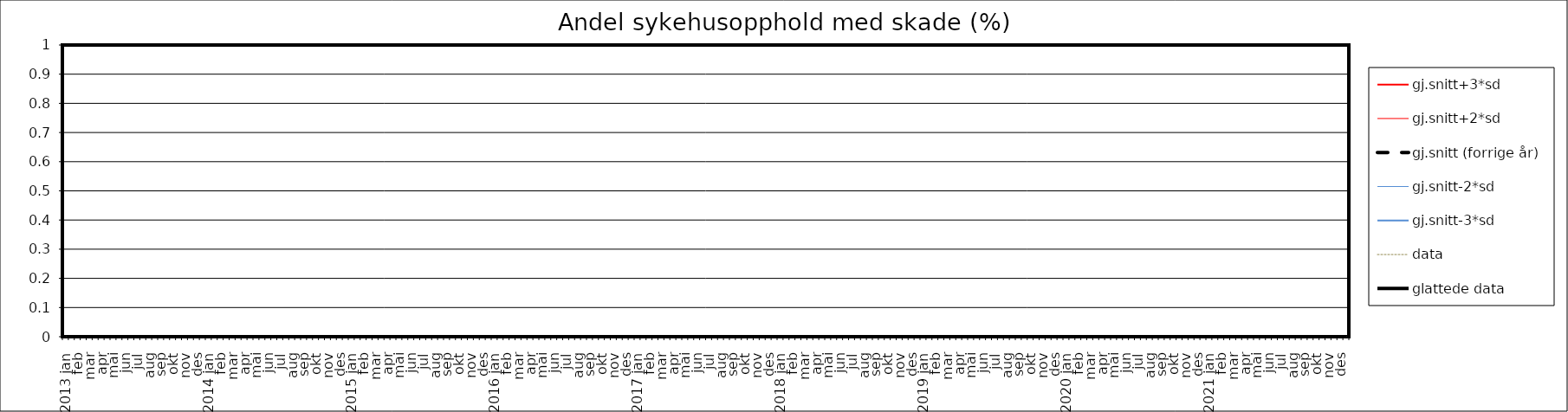
| Category | gj.snitt+3*sd | gj.snitt+2*sd | gj.snitt (forrige år) | gj.snitt-2*sd | gj.snitt-3*sd | data | glattede data |
|---|---|---|---|---|---|---|---|
| 2013 jan | 0 | 0 | 0 | 0 | 0 | 0 | 0 |
|  | 0 | 0 | 0 | 0 | 0 | 0 | 0 |
| feb | 0 | 0 | 0 | 0 | 0 | 0 | 0 |
|  | 0 | 0 | 0 | 0 | 0 | 0 | 0 |
| mar | 0 | 0 | 0 | 0 | 0 | 0 | 0 |
|  | 0 | 0 | 0 | 0 | 0 | 0 | 0 |
| apr | 0 | 0 | 0 | 0 | 0 | 0 | 0 |
|  | 0 | 0 | 0 | 0 | 0 | 0 | 0 |
| mai | 0 | 0 | 0 | 0 | 0 | 0 | 0 |
|  | 0 | 0 | 0 | 0 | 0 | 0 | 0 |
| jun | 0 | 0 | 0 | 0 | 0 | 0 | 0 |
|  | 0 | 0 | 0 | 0 | 0 | 0 | 0 |
| jul | 0 | 0 | 0 | 0 | 0 | 0 | 0 |
|  | 0 | 0 | 0 | 0 | 0 | 0 | 0 |
| aug | 0 | 0 | 0 | 0 | 0 | 0 | 0 |
|  | 0 | 0 | 0 | 0 | 0 | 0 | 0 |
| sep | 0 | 0 | 0 | 0 | 0 | 0 | 0 |
|  | 0 | 0 | 0 | 0 | 0 | 0 | 0 |
| okt | 0 | 0 | 0 | 0 | 0 | 0 | 0 |
|  | 0 | 0 | 0 | 0 | 0 | 0 | 0 |
| nov | 0 | 0 | 0 | 0 | 0 | 0 | 0 |
|  | 0 | 0 | 0 | 0 | 0 | 0 | 0 |
| des | 0 | 0 | 0 | 0 | 0 | 0 | 0 |
|  | 0 | 0 | 0 | 0 | 0 | 0 | 0 |
| 2014 jan | 0 | 0 | 0 | 0 | 0 | 0 | 0 |
|  | 0 | 0 | 0 | 0 | 0 | 0 | 0 |
| feb | 0 | 0 | 0 | 0 | 0 | 0 | 0 |
|  | 0 | 0 | 0 | 0 | 0 | 0 | 0 |
| mar | 0 | 0 | 0 | 0 | 0 | 0 | 0 |
|  | 0 | 0 | 0 | 0 | 0 | 0 | 0 |
| apr | 0 | 0 | 0 | 0 | 0 | 0 | 0 |
|  | 0 | 0 | 0 | 0 | 0 | 0 | 0 |
| mai | 0 | 0 | 0 | 0 | 0 | 0 | 0 |
|  | 0 | 0 | 0 | 0 | 0 | 0 | 0 |
| jun | 0 | 0 | 0 | 0 | 0 | 0 | 0 |
|  | 0 | 0 | 0 | 0 | 0 | 0 | 0 |
| jul | 0 | 0 | 0 | 0 | 0 | 0 | 0 |
|  | 0 | 0 | 0 | 0 | 0 | 0 | 0 |
| aug | 0 | 0 | 0 | 0 | 0 | 0 | 0 |
|  | 0 | 0 | 0 | 0 | 0 | 0 | 0 |
| sep | 0 | 0 | 0 | 0 | 0 | 0 | 0 |
|  | 0 | 0 | 0 | 0 | 0 | 0 | 0 |
| okt | 0 | 0 | 0 | 0 | 0 | 0 | 0 |
|  | 0 | 0 | 0 | 0 | 0 | 0 | 0 |
| nov | 0 | 0 | 0 | 0 | 0 | 0 | 0 |
|  | 0 | 0 | 0 | 0 | 0 | 0 | 0 |
| des | 0 | 0 | 0 | 0 | 0 | 0 | 0 |
|  | 0 | 0 | 0 | 0 | 0 | 0 | 0 |
| 2015 jan | 0 | 0 | 0 | 0 | 0 | 0 | 0 |
|  | 0 | 0 | 0 | 0 | 0 | 0 | 0 |
| feb | 0 | 0 | 0 | 0 | 0 | 0 | 0 |
|  | 0 | 0 | 0 | 0 | 0 | 0 | 0 |
| mar | 0 | 0 | 0 | 0 | 0 | 0 | 0 |
|  | 0 | 0 | 0 | 0 | 0 | 0 | 0 |
| apr | 0 | 0 | 0 | 0 | 0 | 0 | 0 |
|  | 0 | 0 | 0 | 0 | 0 | 0 | 0 |
| mai | 0 | 0 | 0 | 0 | 0 | 0 | 0 |
|  | 0 | 0 | 0 | 0 | 0 | 0 | 0 |
| jun | 0 | 0 | 0 | 0 | 0 | 0 | 0 |
|  | 0 | 0 | 0 | 0 | 0 | 0 | 0 |
| jul | 0 | 0 | 0 | 0 | 0 | 0 | 0 |
|  | 0 | 0 | 0 | 0 | 0 | 0 | 0 |
| aug | 0 | 0 | 0 | 0 | 0 | 0 | 0 |
|  | 0 | 0 | 0 | 0 | 0 | 0 | 0 |
| sep | 0 | 0 | 0 | 0 | 0 | 0 | 0 |
|  | 0 | 0 | 0 | 0 | 0 | 0 | 0 |
| okt | 0 | 0 | 0 | 0 | 0 | 0 | 0 |
|  | 0 | 0 | 0 | 0 | 0 | 0 | 0 |
| nov | 0 | 0 | 0 | 0 | 0 | 0 | 0 |
|  | 0 | 0 | 0 | 0 | 0 | 0 | 0 |
| des | 0 | 0 | 0 | 0 | 0 | 0 | 0 |
|  | 0 | 0 | 0 | 0 | 0 | 0 | 0 |
| 2016 jan | 0 | 0 | 0 | 0 | 0 | 0 | 0 |
|  | 0 | 0 | 0 | 0 | 0 | 0 | 0 |
| feb | 0 | 0 | 0 | 0 | 0 | 0 | 0 |
|  | 0 | 0 | 0 | 0 | 0 | 0 | 0 |
| mar | 0 | 0 | 0 | 0 | 0 | 0 | 0 |
|  | 0 | 0 | 0 | 0 | 0 | 0 | 0 |
| apr | 0 | 0 | 0 | 0 | 0 | 0 | 0 |
|  | 0 | 0 | 0 | 0 | 0 | 0 | 0 |
| mai | 0 | 0 | 0 | 0 | 0 | 0 | 0 |
|  | 0 | 0 | 0 | 0 | 0 | 0 | 0 |
| jun | 0 | 0 | 0 | 0 | 0 | 0 | 0 |
|  | 0 | 0 | 0 | 0 | 0 | 0 | 0 |
| jul | 0 | 0 | 0 | 0 | 0 | 0 | 0 |
|  | 0 | 0 | 0 | 0 | 0 | 0 | 0 |
| aug | 0 | 0 | 0 | 0 | 0 | 0 | 0 |
|  | 0 | 0 | 0 | 0 | 0 | 0 | 0 |
| sep | 0 | 0 | 0 | 0 | 0 | 0 | 0 |
|  | 0 | 0 | 0 | 0 | 0 | 0 | 0 |
| okt | 0 | 0 | 0 | 0 | 0 | 0 | 0 |
|  | 0 | 0 | 0 | 0 | 0 | 0 | 0 |
| nov | 0 | 0 | 0 | 0 | 0 | 0 | 0 |
|  | 0 | 0 | 0 | 0 | 0 | 0 | 0 |
| des | 0 | 0 | 0 | 0 | 0 | 0 | 0 |
|  | 0 | 0 | 0 | 0 | 0 | 0 | 0 |
| 2017 jan | 0 | 0 | 0 | 0 | 0 | 0 | 0 |
|  | 0 | 0 | 0 | 0 | 0 | 0 | 0 |
| feb | 0 | 0 | 0 | 0 | 0 | 0 | 0 |
|  | 0 | 0 | 0 | 0 | 0 | 0 | 0 |
| mar | 0 | 0 | 0 | 0 | 0 | 0 | 0 |
|  | 0 | 0 | 0 | 0 | 0 | 0 | 0 |
| apr | 0 | 0 | 0 | 0 | 0 | 0 | 0 |
|  | 0 | 0 | 0 | 0 | 0 | 0 | 0 |
| mai | 0 | 0 | 0 | 0 | 0 | 0 | 0 |
|  | 0 | 0 | 0 | 0 | 0 | 0 | 0 |
| jun | 0 | 0 | 0 | 0 | 0 | 0 | 0 |
|  | 0 | 0 | 0 | 0 | 0 | 0 | 0 |
| jul | 0 | 0 | 0 | 0 | 0 | 0 | 0 |
|  | 0 | 0 | 0 | 0 | 0 | 0 | 0 |
| aug | 0 | 0 | 0 | 0 | 0 | 0 | 0 |
|  | 0 | 0 | 0 | 0 | 0 | 0 | 0 |
| sep | 0 | 0 | 0 | 0 | 0 | 0 | 0 |
|  | 0 | 0 | 0 | 0 | 0 | 0 | 0 |
| okt | 0 | 0 | 0 | 0 | 0 | 0 | 0 |
|  | 0 | 0 | 0 | 0 | 0 | 0 | 0 |
| nov | 0 | 0 | 0 | 0 | 0 | 0 | 0 |
|  | 0 | 0 | 0 | 0 | 0 | 0 | 0 |
| des | 0 | 0 | 0 | 0 | 0 | 0 | 0 |
|  | 0 | 0 | 0 | 0 | 0 | 0 | 0 |
| 2018 jan | 0 | 0 | 0 | 0 | 0 | 0 | 0 |
|  | 0 | 0 | 0 | 0 | 0 | 0 | 0 |
| feb | 0 | 0 | 0 | 0 | 0 | 0 | 0 |
|  | 0 | 0 | 0 | 0 | 0 | 0 | 0 |
| mar | 0 | 0 | 0 | 0 | 0 | 0 | 0 |
|  | 0 | 0 | 0 | 0 | 0 | 0 | 0 |
| apr | 0 | 0 | 0 | 0 | 0 | 0 | 0 |
|  | 0 | 0 | 0 | 0 | 0 | 0 | 0 |
| mai | 0 | 0 | 0 | 0 | 0 | 0 | 0 |
|  | 0 | 0 | 0 | 0 | 0 | 0 | 0 |
| jun | 0 | 0 | 0 | 0 | 0 | 0 | 0 |
|  | 0 | 0 | 0 | 0 | 0 | 0 | 0 |
| jul | 0 | 0 | 0 | 0 | 0 | 0 | 0 |
|  | 0 | 0 | 0 | 0 | 0 | 0 | 0 |
| aug | 0 | 0 | 0 | 0 | 0 | 0 | 0 |
|  | 0 | 0 | 0 | 0 | 0 | 0 | 0 |
| sep | 0 | 0 | 0 | 0 | 0 | 0 | 0 |
|  | 0 | 0 | 0 | 0 | 0 | 0 | 0 |
| okt | 0 | 0 | 0 | 0 | 0 | 0 | 0 |
|  | 0 | 0 | 0 | 0 | 0 | 0 | 0 |
| nov | 0 | 0 | 0 | 0 | 0 | 0 | 0 |
|  | 0 | 0 | 0 | 0 | 0 | 0 | 0 |
| des | 0 | 0 | 0 | 0 | 0 | 0 | 0 |
|  | 0 | 0 | 0 | 0 | 0 | 0 | 0 |
| 2019 jan | 0 | 0 | 0 | 0 | 0 | 0 | 0 |
|  | 0 | 0 | 0 | 0 | 0 | 0 | 0 |
| feb | 0 | 0 | 0 | 0 | 0 | 0 | 0 |
|  | 0 | 0 | 0 | 0 | 0 | 0 | 0 |
| mar | 0 | 0 | 0 | 0 | 0 | 0 | 0 |
|  | 0 | 0 | 0 | 0 | 0 | 0 | 0 |
| apr | 0 | 0 | 0 | 0 | 0 | 0 | 0 |
|  | 0 | 0 | 0 | 0 | 0 | 0 | 0 |
| mai | 0 | 0 | 0 | 0 | 0 | 0 | 0 |
|  | 0 | 0 | 0 | 0 | 0 | 0 | 0 |
| jun | 0 | 0 | 0 | 0 | 0 | 0 | 0 |
|  | 0 | 0 | 0 | 0 | 0 | 0 | 0 |
| jul | 0 | 0 | 0 | 0 | 0 | 0 | 0 |
|  | 0 | 0 | 0 | 0 | 0 | 0 | 0 |
| aug | 0 | 0 | 0 | 0 | 0 | 0 | 0 |
|  | 0 | 0 | 0 | 0 | 0 | 0 | 0 |
| sep | 0 | 0 | 0 | 0 | 0 | 0 | 0 |
|  | 0 | 0 | 0 | 0 | 0 | 0 | 0 |
| okt | 0 | 0 | 0 | 0 | 0 | 0 | 0 |
|  | 0 | 0 | 0 | 0 | 0 | 0 | 0 |
| nov | 0 | 0 | 0 | 0 | 0 | 0 | 0 |
|  | 0 | 0 | 0 | 0 | 0 | 0 | 0 |
| des | 0 | 0 | 0 | 0 | 0 | 0 | 0 |
|  | 0 | 0 | 0 | 0 | 0 | 0 | 0 |
| 2020 jan | 0 | 0 | 0 | 0 | 0 | 0 | 0 |
|  | 0 | 0 | 0 | 0 | 0 | 0 | 0 |
| feb | 0 | 0 | 0 | 0 | 0 | 0 | 0 |
|  | 0 | 0 | 0 | 0 | 0 | 0 | 0 |
| mar | 0 | 0 | 0 | 0 | 0 | 0 | 0 |
|  | 0 | 0 | 0 | 0 | 0 | 0 | 0 |
| apr | 0 | 0 | 0 | 0 | 0 | 0 | 0 |
|  | 0 | 0 | 0 | 0 | 0 | 0 | 0 |
| mai | 0 | 0 | 0 | 0 | 0 | 0 | 0 |
|  | 0 | 0 | 0 | 0 | 0 | 0 | 0 |
| jun | 0 | 0 | 0 | 0 | 0 | 0 | 0 |
|  | 0 | 0 | 0 | 0 | 0 | 0 | 0 |
| jul | 0 | 0 | 0 | 0 | 0 | 0 | 0 |
|  | 0 | 0 | 0 | 0 | 0 | 0 | 0 |
| aug | 0 | 0 | 0 | 0 | 0 | 0 | 0 |
|  | 0 | 0 | 0 | 0 | 0 | 0 | 0 |
| sep | 0 | 0 | 0 | 0 | 0 | 0 | 0 |
|  | 0 | 0 | 0 | 0 | 0 | 0 | 0 |
| okt | 0 | 0 | 0 | 0 | 0 | 0 | 0 |
|  | 0 | 0 | 0 | 0 | 0 | 0 | 0 |
| nov | 0 | 0 | 0 | 0 | 0 | 0 | 0 |
|  | 0 | 0 | 0 | 0 | 0 | 0 | 0 |
| des | 0 | 0 | 0 | 0 | 0 | 0 | 0 |
|  | 0 | 0 | 0 | 0 | 0 | 0 | 0 |
| 2021 jan | 0 | 0 | 0 | 0 | 0 | 0 | 0 |
|  | 0 | 0 | 0 | 0 | 0 | 0 | 0 |
| feb | 0 | 0 | 0 | 0 | 0 | 0 | 0 |
|  | 0 | 0 | 0 | 0 | 0 | 0 | 0 |
| mar | 0 | 0 | 0 | 0 | 0 | 0 | 0 |
|  | 0 | 0 | 0 | 0 | 0 | 0 | 0 |
| apr | 0 | 0 | 0 | 0 | 0 | 0 | 0 |
|  | 0 | 0 | 0 | 0 | 0 | 0 | 0 |
| mai | 0 | 0 | 0 | 0 | 0 | 0 | 0 |
|  | 0 | 0 | 0 | 0 | 0 | 0 | 0 |
| jun | 0 | 0 | 0 | 0 | 0 | 0 | 0 |
|  | 0 | 0 | 0 | 0 | 0 | 0 | 0 |
| jul | 0 | 0 | 0 | 0 | 0 | 0 | 0 |
|  | 0 | 0 | 0 | 0 | 0 | 0 | 0 |
| aug | 0 | 0 | 0 | 0 | 0 | 0 | 0 |
|  | 0 | 0 | 0 | 0 | 0 | 0 | 0 |
| sep | 0 | 0 | 0 | 0 | 0 | 0 | 0 |
|  | 0 | 0 | 0 | 0 | 0 | 0 | 0 |
| okt | 0 | 0 | 0 | 0 | 0 | 0 | 0 |
|  | 0 | 0 | 0 | 0 | 0 | 0 | 0 |
| nov | 0 | 0 | 0 | 0 | 0 | 0 | 0 |
|  | 0 | 0 | 0 | 0 | 0 | 0 | 0 |
| des | 0 | 0 | 0 | 0 | 0 | 0 | 0 |